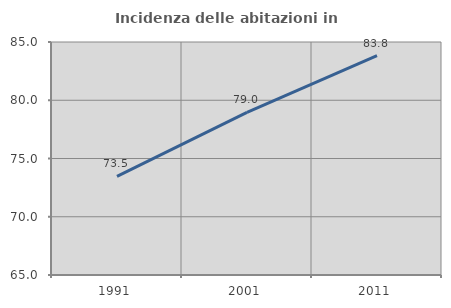
| Category | Incidenza delle abitazioni in proprietà  |
|---|---|
| 1991.0 | 73.466 |
| 2001.0 | 78.955 |
| 2011.0 | 83.82 |